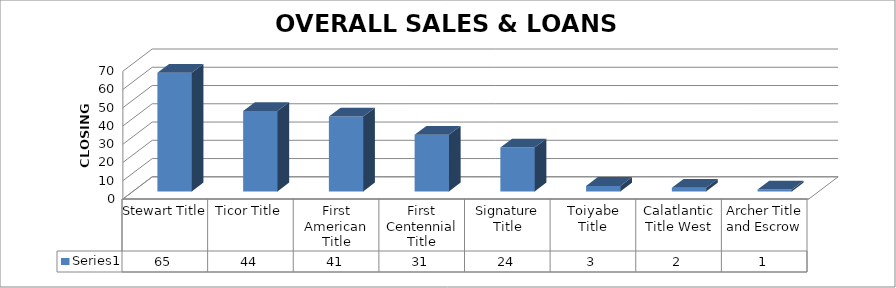
| Category | Series 0 |
|---|---|
| Stewart Title | 65 |
| Ticor Title | 44 |
| First American Title | 41 |
| First Centennial Title | 31 |
| Signature Title | 24 |
| Toiyabe Title | 3 |
| Calatlantic Title West | 2 |
| Archer Title and Escrow | 1 |